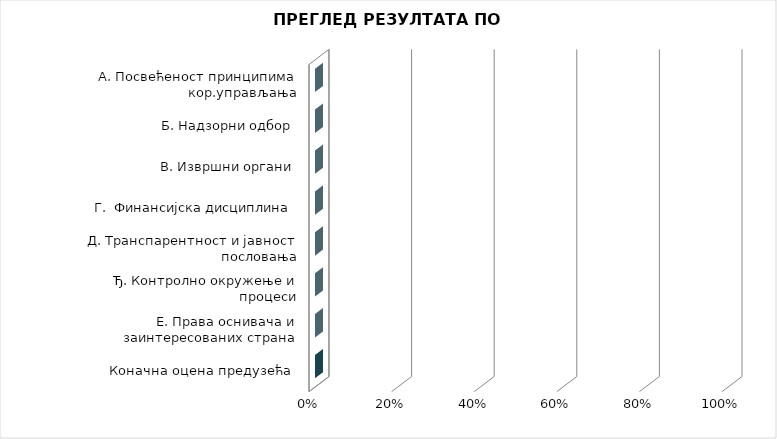
| Category | Коначна оцена предузећа |
|---|---|
| Коначна оцена предузећа | 0 |
| Е. Права оснивача и заинтересованих страна | 0 |
| Ђ. Контролно окружење и процеси | 0 |
| Д. Транспарентност и јавност пословања | 0 |
| Г.  Финансијска дисциплина | 0 |
| В. Извршни органи | 0 |
| Б. Надзорни одбор | 0 |
| A. Посвећеност принципима кор.управљања | 0 |